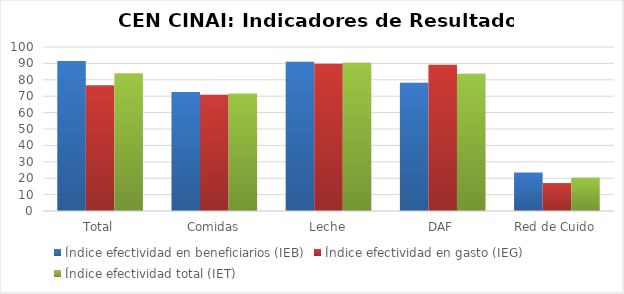
| Category | Índice efectividad en beneficiarios (IEB) | Índice efectividad en gasto (IEG)  | Índice efectividad total (IET) |
|---|---|---|---|
| Total | 91.453 | 76.617 | 84.035 |
| Comidas | 72.627 | 70.81 | 71.718 |
| Leche | 90.982 | 89.862 | 90.422 |
| DAF | 78.258 | 89.168 | 83.713 |
| Red de Cuido | 23.518 | 17.028 | 20.273 |